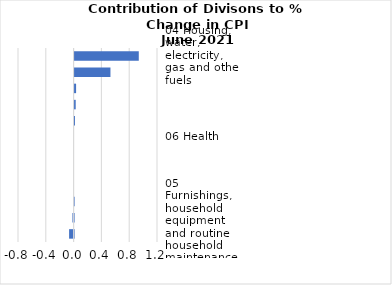
| Category |     Contributions |
|---|---|
| 04 Housing, water, electricity, gas and other fuels | 0.923 |
| 01 Food and non-alcoholic beverages | 0.516 |
| 03 Clothing and footwear | 0.021 |
| 02 Alcoholic beverages, tobacco and narcotics | 0.016 |
| 09 Recreation and culture | 0.006 |
| 06 Health | 0 |
| 08 Communication | 0 |
| 11 Restaurants and hotels | 0 |
| 10 Education | 0 |
| 07 Transport | -0.006 |
| 05 Furnishings, household equipment and routine household maintenance | -0.017 |
| 12 Miscellaneous goods and services | -0.065 |